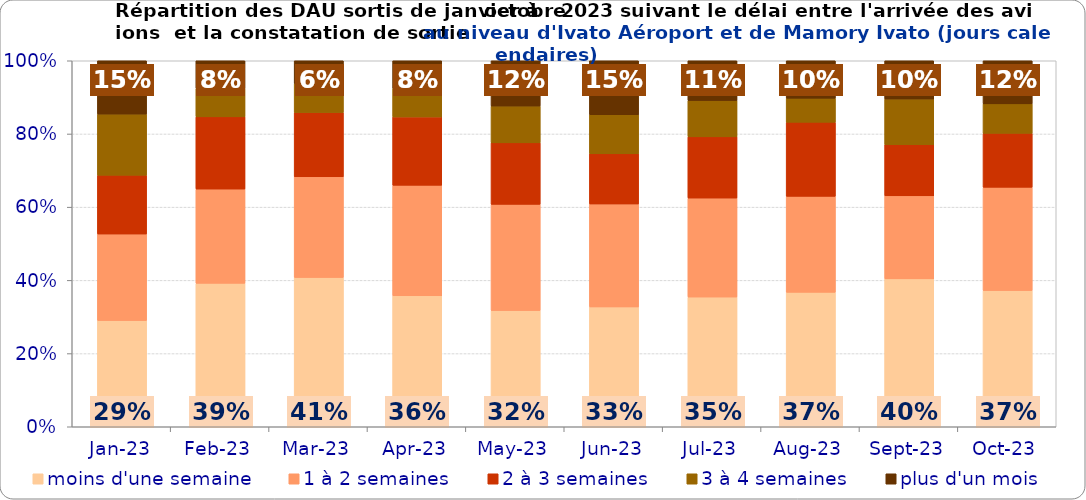
| Category | moins d'une semaine | 1 à 2 semaines | 2 à 3 semaines | 3 à 4 semaines | plus d'un mois |
|---|---|---|---|---|---|
| 2023-01-01 | 0.29 | 0.236 | 0.161 | 0.167 | 0.146 |
| 2023-02-01 | 0.392 | 0.258 | 0.197 | 0.077 | 0.076 |
| 2023-03-01 | 0.408 | 0.275 | 0.176 | 0.079 | 0.062 |
| 2023-04-01 | 0.358 | 0.302 | 0.187 | 0.078 | 0.076 |
| 2023-05-01 | 0.317 | 0.29 | 0.168 | 0.101 | 0.124 |
| 2023-06-01 | 0.327 | 0.281 | 0.137 | 0.107 | 0.147 |
| 2023-07-01 | 0.354 | 0.27 | 0.167 | 0.099 | 0.109 |
| 2023-08-01 | 0.367 | 0.262 | 0.202 | 0.066 | 0.102 |
| 2023-09-01 | 0.404 | 0.227 | 0.14 | 0.125 | 0.105 |
| 2023-10-01 | 0.372 | 0.282 | 0.147 | 0.081 | 0.118 |